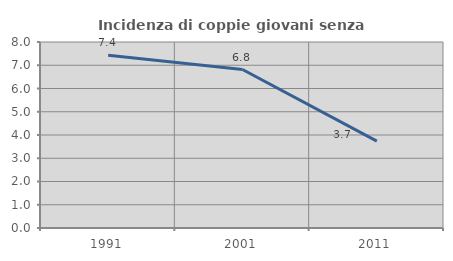
| Category | Incidenza di coppie giovani senza figli |
|---|---|
| 1991.0 | 7.428 |
| 2001.0 | 6.816 |
| 2011.0 | 3.737 |